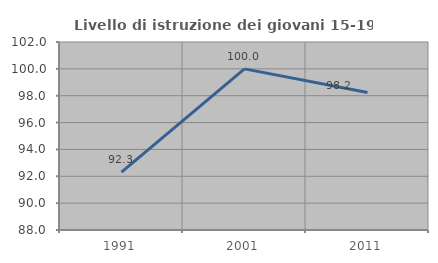
| Category | Livello di istruzione dei giovani 15-19 anni |
|---|---|
| 1991.0 | 92.308 |
| 2001.0 | 100 |
| 2011.0 | 98.246 |